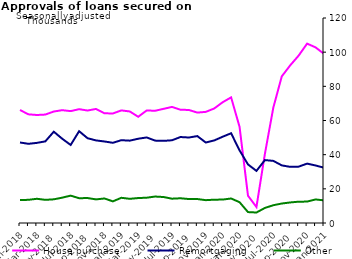
| Category | House purchase | Remortgaging | Other |
|---|---|---|---|
| Jan-2018 | 66135 | 47135 | 13388 |
| Feb-2018 | 63609 | 46351 | 13576 |
| Mar-2018 | 63223 | 46905 | 14172 |
| Apr-2018 | 63473 | 47782 | 13553 |
| May-2018 | 65260 | 53444 | 13862 |
| Jun-2018 | 66043 | 49321 | 14839 |
| Jul-2018 | 65495 | 45682 | 16022 |
| Aug-2018 | 66626 | 53732 | 14507 |
| Sep-2018 | 65836 | 49629 | 14616 |
| Oct-2018 | 66768 | 48345 | 13816 |
| Nov-2018 | 64214 | 47723 | 14353 |
| Dec-2018 | 64119 | 46947 | 12665 |
| Jan-2019 | 65911 | 48477 | 14756 |
| Feb-2019 | 65297 | 48203 | 14155 |
| Mar-2019 | 62178 | 49327 | 14605 |
| Apr-2019 | 65865 | 50081 | 14800 |
| May-2019 | 65704 | 48227 | 15490 |
| Jun-2019 | 66822 | 48076 | 15201 |
| Jul-2019 | 67951 | 48427 | 14235 |
| Aug-2019 | 66303 | 50330 | 14474 |
| Sep-2019 | 66170 | 50035 | 14026 |
| Oct-2019 | 64625 | 50877 | 14030 |
| Nov-2019 | 65056 | 47108 | 13365 |
| Dec-2019 | 67038 | 48324 | 13660 |
| Jan-2020 | 70690 | 50501 | 13705 |
| Feb-2020 | 73539 | 52534 | 14343 |
| Mar-2020 | 56282 | 42503 | 12173 |
| Apr-2020 | 15933 | 34278 | 6385 |
| May-2020 | 9370 | 30502 | 6141 |
| Jun-2020 | 40436 | 36825 | 8809 |
| Jul-2020 | 67570 | 36364 | 10412 |
| Aug-2020 | 85831 | 33729 | 11402 |
| Sep-2020 | 92295 | 32861 | 12026 |
| Oct-2020 | 98007 | 32993 | 12480 |
| Nov-2020 | 105009 | 34764 | 12530 |
| Dec-2020 | 102809 | 33667 | 13791 |
| Jan-2021 | 98994 | 32367 | 13246 |